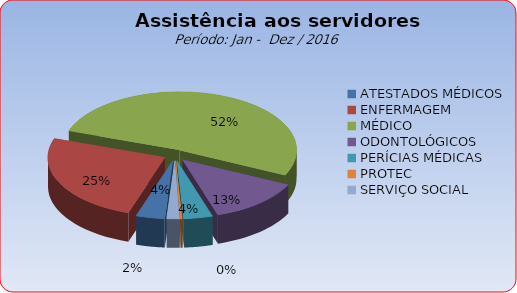
| Category | Series 0 |
|---|---|
| ATESTADOS MÉDICOS | 3.963 |
| ENFERMAGEM | 25.229 |
| MÉDICO | 51.804 |
| ODONTOLÓGICOS | 13.008 |
| PERÍCIAS MÉDICAS | 3.976 |
| PROTEC | 0.254 |
| SERVIÇO SOCIAL | 1.766 |